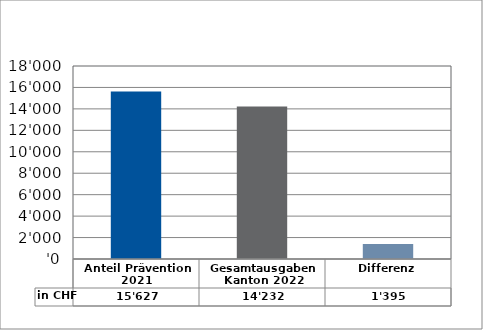
| Category | in CHF |
|---|---|
| Anteil Prävention 2021

 | 15627 |
| Gesamtausgaben Kanton 2022
 | 14231.75 |
| Differenz | 1395.25 |